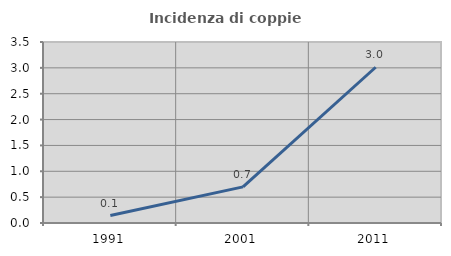
| Category | Incidenza di coppie miste |
|---|---|
| 1991.0 | 0.145 |
| 2001.0 | 0.698 |
| 2011.0 | 3.012 |